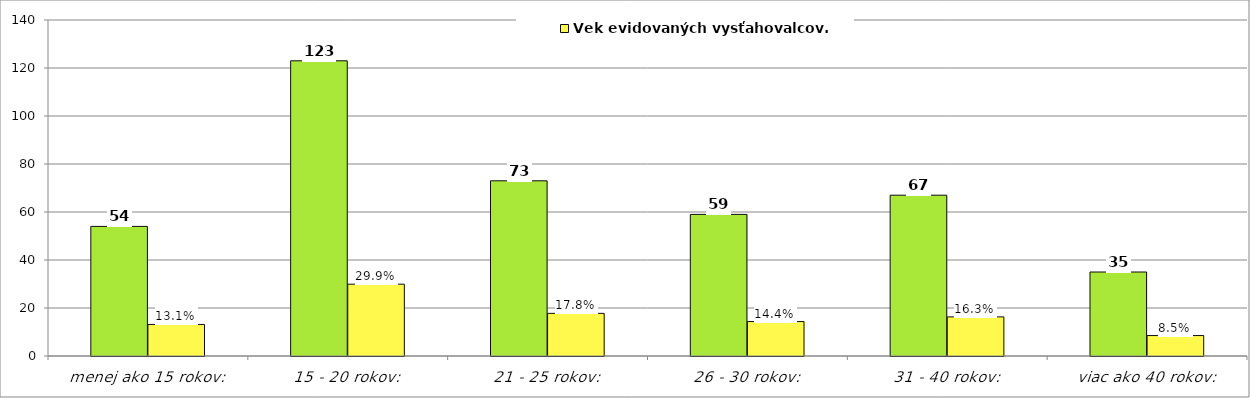
| Category | Series 0 | Vek evidovaných vysťahovalcov. |
|---|---|---|
| menej ako 15 rokov: | 54 | 13.139 |
| 15 - 20 rokov: | 123 | 29.927 |
| 21 - 25 rokov: | 73 | 17.762 |
| 26 - 30 rokov: | 59 | 14.355 |
| 31 - 40 rokov: | 67 | 16.302 |
| viac ako 40 rokov: | 35 | 8.516 |